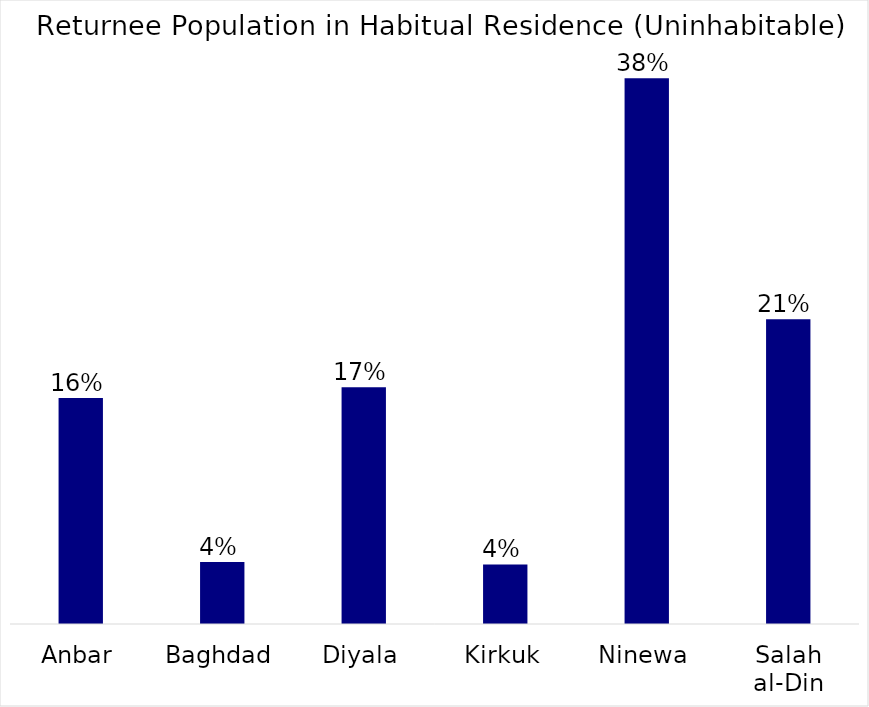
| Category | Series 0 |
|---|---|
| Anbar | 0.158 |
| Baghdad | 0.043 |
| Diyala | 0.165 |
| Kirkuk | 0.041 |
| Ninewa | 0.38 |
| Salah al-Din | 0.212 |